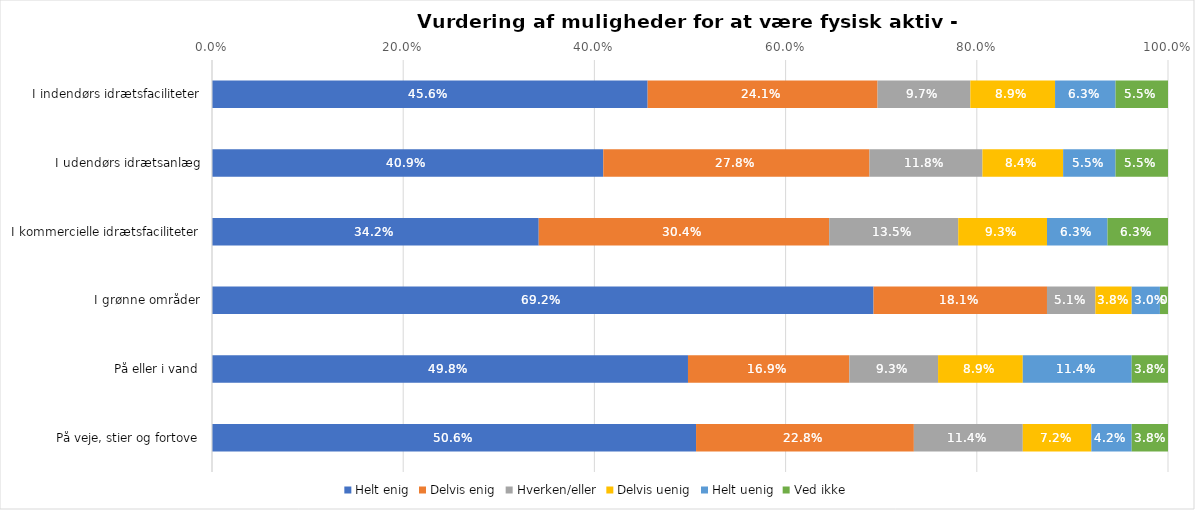
| Category | Helt enig | Delvis enig | Hverken/eller | Delvis uenig | Helt uenig | Ved ikke |
|---|---|---|---|---|---|---|
| I indendørs idrætsfaciliteter | 0.456 | 0.241 | 0.097 | 0.089 | 0.063 | 0.055 |
| I udendørs idrætsanlæg | 0.409 | 0.278 | 0.118 | 0.084 | 0.055 | 0.055 |
| I kommercielle idrætsfaciliteter | 0.342 | 0.304 | 0.135 | 0.093 | 0.063 | 0.063 |
| I grønne områder | 0.692 | 0.181 | 0.051 | 0.038 | 0.03 | 0.008 |
| På eller i vand | 0.498 | 0.169 | 0.093 | 0.089 | 0.114 | 0.038 |
| På veje, stier og fortove | 0.506 | 0.228 | 0.114 | 0.072 | 0.042 | 0.038 |